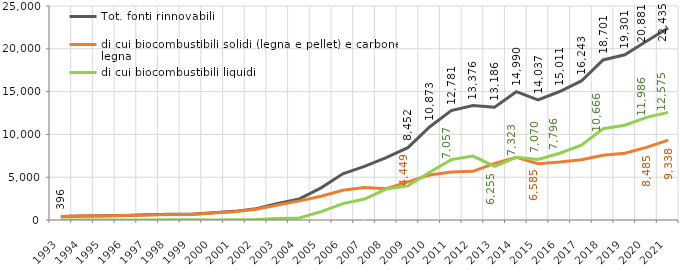
| Category | Tot. fonti rinnovabili | di cui biocombustibili solidi (legna e pellet) e carbone da legna  | di cui biocombustibili liquidi |
|---|---|---|---|
| 1993 | 395.695 | 395.695 | 0 |
| 1994 | 459.125 | 457.711 | 1.414 |
| 1995 | 485.173 | 477.75 | 7.423 |
| 1996 | 524.11 | 516.422 | 7.688 |
| 1997 | 608.358 | 598.284 | 10.075 |
| 1998 | 659.557 | 631.795 | 27.762 |
| 1999 | 674.126 | 651.034 | 23.091 |
| 2000 | 838.306 | 828.058 | 10.246 |
| 2001 | 1008.8 | 975.054 | 33.745 |
| 2002 | 1323.646 | 1268.552 | 54.877 |
| 2003 | 1921.278 | 1748.371 | 172.524 |
| 2004 | 2460.618 | 2232.062 | 228.247 |
| 2005 | 3753.72 | 2771.009 | 979.462 |
| 2006 | 5393.189 | 3469.446 | 1918.203 |
| 2007 | 6268.224 | 3798.729 | 2452.323 |
| 2008 | 7275.985 | 3658.999 | 3613.095 |
| 2009 | 8451.512 | 4448.568 | 3983.355 |
| 2010 | 10872.825 | 5249.034 | 5588.145 |
| 2011 | 12780.579 | 5617.822 | 7056.96 |
| 2012 | 13375.531 | 5683.773 | 7472.594 |
| 2013 | 13186.123 | 6610.73 | 6254.551 |
| 2014 | 14989.84 | 7327.337 | 7322.871 |
| 2015 | 14036.56 | 6585.26 | 7069.547 |
| 2016 | 15010.716 | 6772.129 | 7796.372 |
| 2017 | 16243.207 | 7040.013 | 8741.007 |
| 2018 | 18700.543 | 7569.972 | 10666.311 |
| 2019 | 19300.77 | 7791.687 | 11067.408 |
| 2020 | 20881.076 | 8484.546 | 11985.633 |
| 2021 | 22435.338 | 9337.951 | 12575.499 |